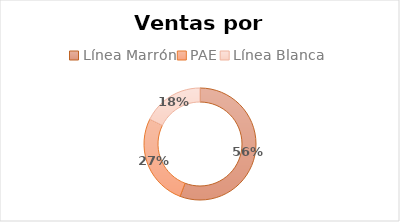
| Category | Total |
|---|---|
| Línea Marrón | 267284 |
| PAE | 127038 |
| Línea Blanca | 84744 |